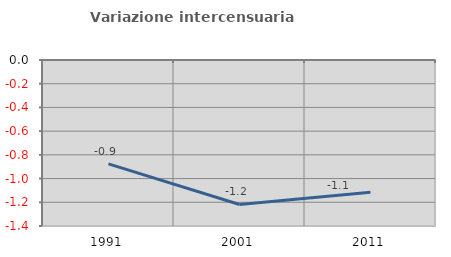
| Category | Variazione intercensuaria annua |
|---|---|
| 1991.0 | -0.876 |
| 2001.0 | -1.219 |
| 2011.0 | -1.115 |